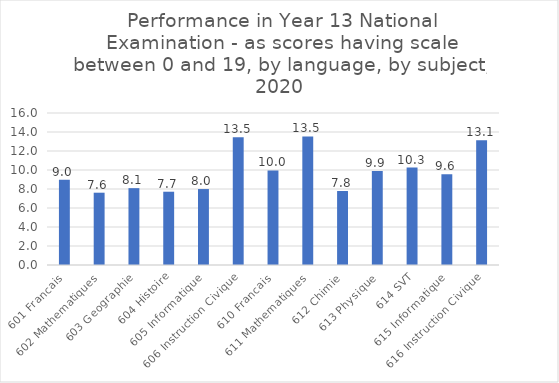
| Category | Series 0 |
|---|---|
| 601 Francais | 8.972 |
| 602 Mathematiques | 7.61 |
| 603 Geographie | 8.089 |
| 604 Histoire | 7.714 |
| 605 Informatique | 7.995 |
| 606 Instruction Civique | 13.455 |
| 610 Francais | 9.955 |
| 611 Mathematiques | 13.536 |
| 612 Chimie | 7.788 |
| 613 Physique | 9.894 |
| 614 SVT | 10.251 |
| 615 Informatique | 9.564 |
| 616 Instruction Civique | 13.128 |